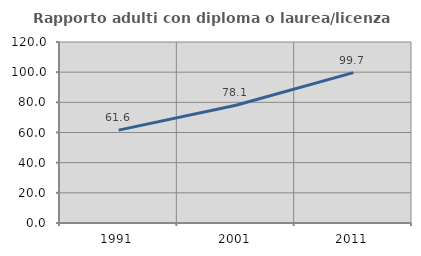
| Category | Rapporto adulti con diploma o laurea/licenza media  |
|---|---|
| 1991.0 | 61.554 |
| 2001.0 | 78.076 |
| 2011.0 | 99.683 |